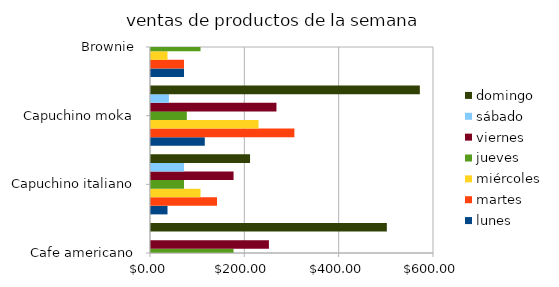
| Category | lunes | martes | miércoles | jueves | viernes | sábado | domingo |
|---|---|---|---|---|---|---|---|
| Cafe americano | 75 | 150 | 125 | 175 | 250 | 0 | 500 |
| Capuchino italiano | 35 | 140 | 105 | 70 | 175 | 70 | 210 |
| Capuchino moka | 114 | 304 | 228 | 76 | 266 | 38 | 570 |
| Brownie | 70 | 70 | 35 | 105 | 140 | 0 | 210 |